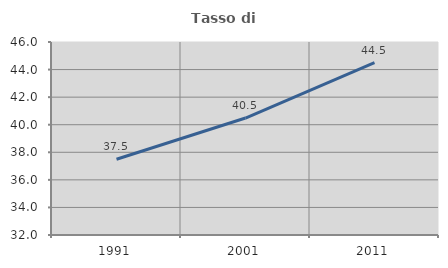
| Category | Tasso di occupazione   |
|---|---|
| 1991.0 | 37.494 |
| 2001.0 | 40.485 |
| 2011.0 | 44.496 |